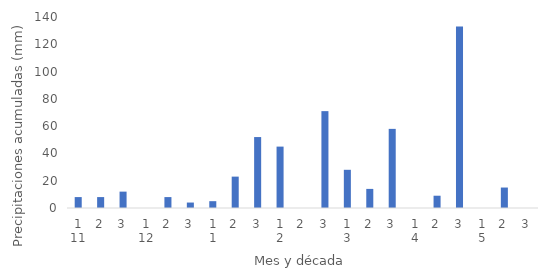
| Category | Series 0 |
|---|---|
| 0 | 8 |
| 1 | 8 |
| 2 | 12 |
| 3 | 0 |
| 4 | 8 |
| 5 | 4 |
| 6 | 5 |
| 7 | 23 |
| 8 | 52 |
| 9 | 45 |
| 10 | 0 |
| 11 | 71 |
| 12 | 28 |
| 13 | 14 |
| 14 | 58 |
| 15 | 0 |
| 16 | 9 |
| 17 | 133 |
| 18 | 0 |
| 19 | 15 |
| 20 | 0 |